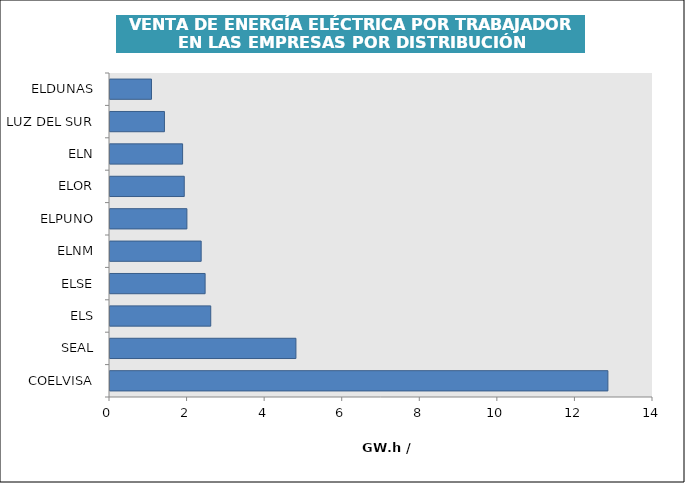
| Category | Series 0 |
|---|---|
| COELVISA | 12.837 |
| SEAL | 4.794 |
| ELS | 2.598 |
| ELSE | 2.453 |
| ELNM | 2.351 |
| ELPUNO | 1.983 |
| ELOR | 1.915 |
| ELN | 1.872 |
| LUZ DEL SUR | 1.404 |
| ELDUNAS | 1.07 |